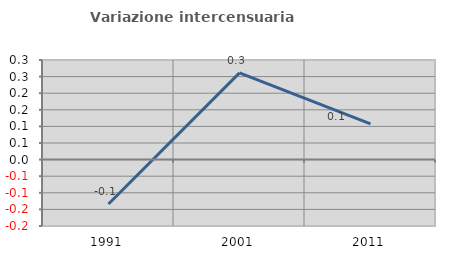
| Category | Variazione intercensuaria annua |
|---|---|
| 1991.0 | -0.134 |
| 2001.0 | 0.261 |
| 2011.0 | 0.108 |